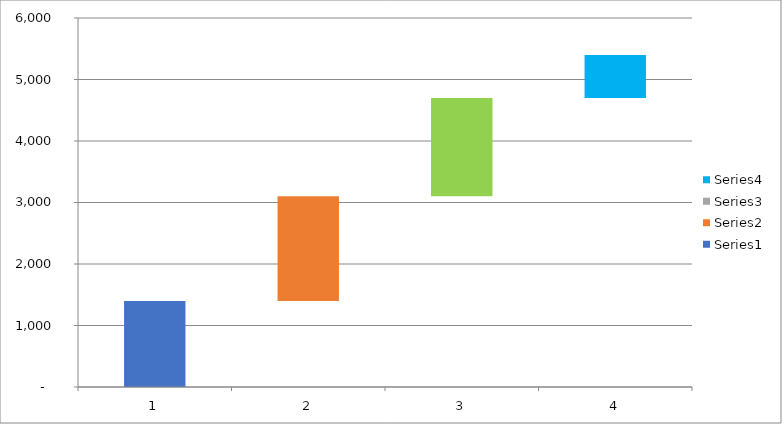
| Category | Series 0 | Series 1 | Series 2 | Series 3 |
|---|---|---|---|---|
| 0 | 1400 | 0 | 0 | 0 |
| 1 | 1400 | 1700 | 0 | 0 |
| 2 | 1400 | 1700 | 1600 | 0 |
| 3 | 1400 | 1700 | 1600 | 700 |